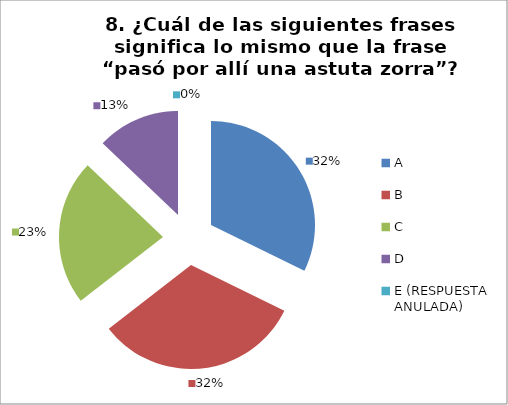
| Category | CANTIDAD DE RESPUESTAS PREGUNTA (8) | PORCENTAJE |
|---|---|---|
| A | 10 | 0.323 |
| B | 10 | 0.323 |
| C | 7 | 0.226 |
| D | 4 | 0.129 |
| E (RESPUESTA ANULADA) | 0 | 0 |